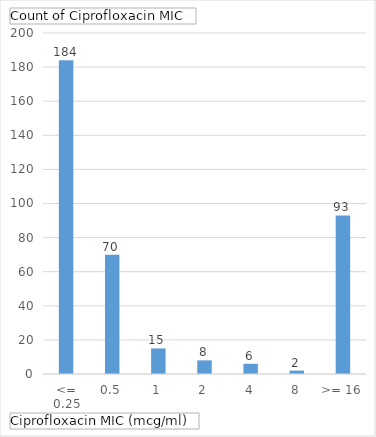
| Category | Total |
|---|---|
| <= 0.25 | 184 |
| 0.5 | 70 |
| 1 | 15 |
| 2 | 8 |
| 4 | 6 |
| 8 | 2 |
| >= 16 | 93 |